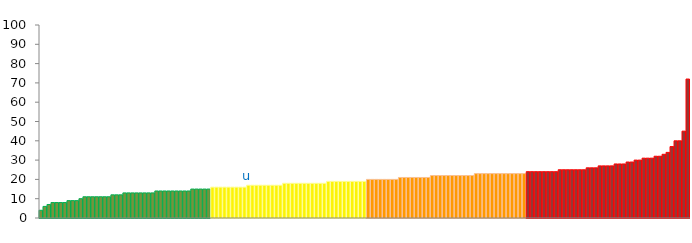
| Category | Top Quartile | 2nd Quartile | 3rd Quartile | Bottom Quartile | Series 4 |
|---|---|---|---|---|---|
|  | 4 | 0 | 0 | 0 | 4 |
|  | 6 | 0 | 0 | 0 | 6 |
|  | 7 | 0 | 0 | 0 | 7 |
|  | 8 | 0 | 0 | 0 | 8 |
|  | 8 | 0 | 0 | 0 | 8 |
|  | 8 | 0 | 0 | 0 | 8 |
|  | 8 | 0 | 0 | 0 | 8 |
|  | 9 | 0 | 0 | 0 | 9 |
|  | 9 | 0 | 0 | 0 | 9 |
|  | 9 | 0 | 0 | 0 | 9 |
|  | 10 | 0 | 0 | 0 | 10 |
|  | 11 | 0 | 0 | 0 | 11 |
|  | 11 | 0 | 0 | 0 | 11 |
|  | 11 | 0 | 0 | 0 | 11 |
|  | 11 | 0 | 0 | 0 | 11 |
|  | 11 | 0 | 0 | 0 | 11 |
|  | 11 | 0 | 0 | 0 | 11 |
|  | 11 | 0 | 0 | 0 | 11 |
|  | 12 | 0 | 0 | 0 | 12 |
|  | 12 | 0 | 0 | 0 | 12 |
|  | 12 | 0 | 0 | 0 | 12 |
|  | 13 | 0 | 0 | 0 | 13 |
|  | 13 | 0 | 0 | 0 | 13 |
|  | 13 | 0 | 0 | 0 | 13 |
|  | 13 | 0 | 0 | 0 | 13 |
|  | 13 | 0 | 0 | 0 | 13 |
|  | 13 | 0 | 0 | 0 | 13 |
|  | 13 | 0 | 0 | 0 | 13 |
|  | 13 | 0 | 0 | 0 | 13 |
|  | 14 | 0 | 0 | 0 | 14 |
|  | 14 | 0 | 0 | 0 | 14 |
|  | 14 | 0 | 0 | 0 | 14 |
|  | 14 | 0 | 0 | 0 | 14 |
|  | 14 | 0 | 0 | 0 | 14 |
|  | 14 | 0 | 0 | 0 | 14 |
|  | 14 | 0 | 0 | 0 | 14 |
|  | 14 | 0 | 0 | 0 | 14 |
|  | 14 | 0 | 0 | 0 | 14 |
|  | 15 | 0 | 0 | 0 | 15 |
|  | 15 | 0 | 0 | 0 | 15 |
|  | 15 | 0 | 0 | 0 | 15 |
|  | 15 | 0 | 0 | 0 | 15 |
|  | 15 | 0 | 0 | 0 | 15 |
|  | 0 | 16 | 0 | 0 | 16 |
|  | 0 | 16 | 0 | 0 | 16 |
|  | 0 | 16 | 0 | 0 | 16 |
|  | 0 | 16 | 0 | 0 | 16 |
|  | 0 | 16 | 0 | 0 | 16 |
|  | 0 | 16 | 0 | 0 | 16 |
|  | 0 | 16 | 0 | 0 | 16 |
|  | 0 | 16 | 0 | 0 | 16 |
|  | 0 | 16 | 0 | 0 | 16 |
| u | 0 | 17 | 0 | 0 | 17 |